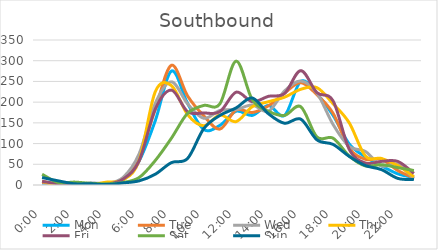
| Category | Mon | Tue | Wed | Thu | Fri | Sat | Sun |
|---|---|---|---|---|---|---|---|
| 0.0 | 4 | 6 | 8 | 9 | 9 | 26 | 18 |
| 0.041667 | 4 | 2 | 3 | 0 | 3 | 6 | 10 |
| 0.083333 | 1 | 0 | 1 | 0 | 2 | 7 | 3 |
| 0.125 | 4 | 1 | 5 | 1 | 1 | 4 | 3 |
| 0.166667 | 2 | 3 | 4 | 7 | 2 | 3 | 1 |
| 0.208333 | 12 | 12 | 18 | 12 | 14 | 6 | 5 |
| 0.25 | 58 | 69 | 75 | 59 | 58 | 18 | 10 |
| 0.291667 | 155 | 183 | 197 | 225 | 183 | 59 | 26 |
| 0.333333 | 275 | 289 | 249 | 240 | 229 | 113 | 54 |
| 0.375 | 197 | 215 | 196 | 170 | 177 | 173 | 64 |
| 0.416667 | 134 | 167 | 161 | 143 | 174 | 192 | 136 |
| 0.458333 | 144 | 135 | 180 | 169 | 177 | 196 | 168 |
| 0.5 | 178 | 181 | 182 | 153 | 224 | 299 | 186 |
| 0.541667 | 168 | 175 | 193 | 189 | 201 | 206 | 210 |
| 0.5833333333333334 | 192 | 191 | 178 | 201 | 214 | 178 | 172 |
| 0.625 | 168 | 222 | 227 | 212 | 221 | 168 | 149 |
| 0.666667 | 250 | 247 | 251 | 231 | 276 | 189 | 159 |
| 0.708333 | 220 | 218 | 222 | 235 | 223 | 116 | 109 |
| 0.75 | 168 | 173 | 146 | 196 | 203 | 113 | 98 |
| 0.791667 | 99 | 89 | 93 | 150 | 86 | 70 | 69 |
| 0.833333 | 68 | 62 | 81 | 70 | 53 | 46 | 47 |
| 0.875 | 46 | 62 | 46 | 64 | 57 | 49 | 37 |
| 0.916667 | 27 | 35 | 50 | 47 | 57 | 42 | 16 |
| 0.958333 | 18 | 17 | 15 | 20 | 28 | 35 | 13 |